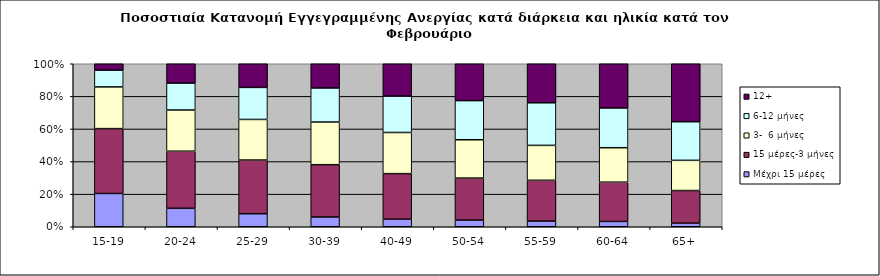
| Category | Μέχρι 15 μέρες | 15 μέρες-3 μήνες | 3-  6 μήνες | 6-12 μήνες | 12+ |
|---|---|---|---|---|---|
| 15-19 | 0.204 | 0.398 | 0.256 | 0.103 | 0.039 |
| 20-24 | 0.113 | 0.35 | 0.253 | 0.165 | 0.119 |
| 25-29 | 0.08 | 0.329 | 0.249 | 0.197 | 0.145 |
| 30-39 | 0.06 | 0.321 | 0.262 | 0.209 | 0.148 |
| 40-49 | 0.047 | 0.279 | 0.252 | 0.223 | 0.198 |
| 50-54 | 0.041 | 0.258 | 0.235 | 0.24 | 0.226 |
| 55-59 | 0.035 | 0.25 | 0.214 | 0.261 | 0.239 |
| 60-64 | 0.033 | 0.241 | 0.211 | 0.244 | 0.271 |
| 65+ | 0.022 | 0.2 | 0.185 | 0.237 | 0.356 |